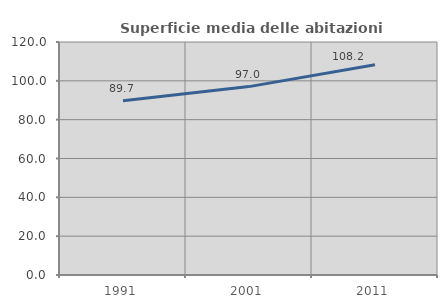
| Category | Superficie media delle abitazioni occupate |
|---|---|
| 1991.0 | 89.748 |
| 2001.0 | 97.028 |
| 2011.0 | 108.248 |